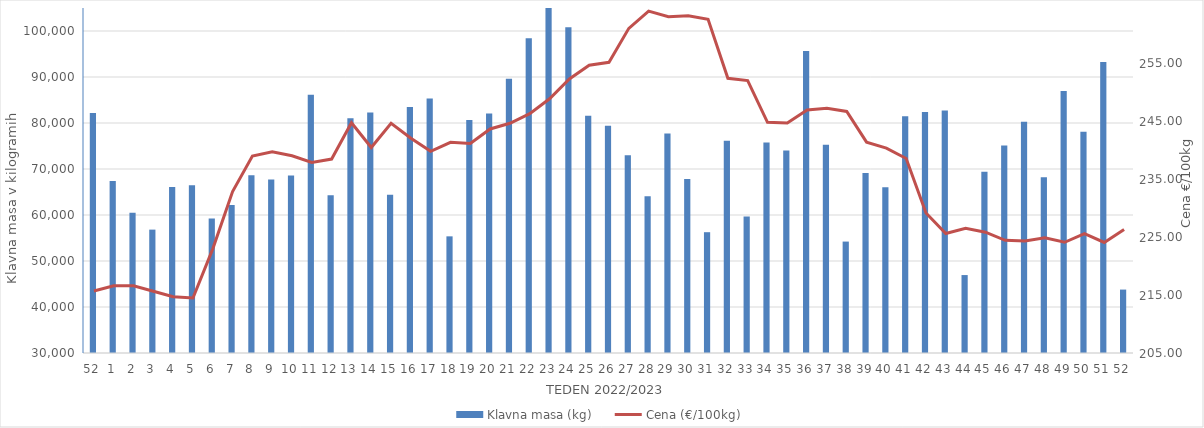
| Category | Klavna masa (kg) |
|---|---|
| 52.0 | 82174 |
| 1.0 | 67372 |
| 2.0 | 60475 |
| 3.0 | 56821 |
| 4.0 | 66062 |
| 5.0 | 66470 |
| 6.0 | 59223 |
| 7.0 | 62200 |
| 8.0 | 68623 |
| 9.0 | 67726 |
| 10.0 | 68581 |
| 11.0 | 86137 |
| 12.0 | 64272 |
| 13.0 | 81041 |
| 14.0 | 82287 |
| 15.0 | 64393 |
| 16.0 | 83478 |
| 17.0 | 85347 |
| 18.0 | 55359 |
| 19.0 | 80671 |
| 20.0 | 82052 |
| 21.0 | 89608 |
| 22.0 | 98410 |
| 23.0 | 115678 |
| 24.0 | 100818 |
| 25.0 | 81593 |
| 26.0 | 79396 |
| 27.0 | 72971 |
| 28.0 | 64084 |
| 29.0 | 77711 |
| 30.0 | 67820 |
| 31.0 | 56261 |
| 32.0 | 76162 |
| 33.0 | 59665 |
| 34.0 | 75777 |
| 35.0 | 74018 |
| 36.0 | 95645 |
| 37.0 | 75252 |
| 38.0 | 54223 |
| 39.0 | 69132 |
| 40.0 | 66024 |
| 41.0 | 81445 |
| 42.0 | 82366 |
| 43.0 | 82742 |
| 44.0 | 46943 |
| 45.0 | 69377 |
| 46.0 | 75131 |
| 47.0 | 80286 |
| 48.0 | 68209 |
| 49.0 | 86978 |
| 50.0 | 78092 |
| 51.0 | 93279 |
| 52.0 | 43787 |